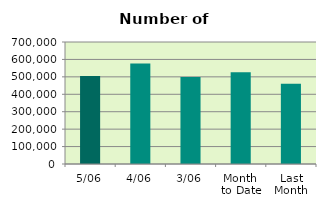
| Category | Series 0 |
|---|---|
| 5/06 | 504454 |
| 4/06 | 576794 |
| 3/06 | 499192 |
| Month 
to Date | 526813.333 |
| Last
Month | 461152.818 |